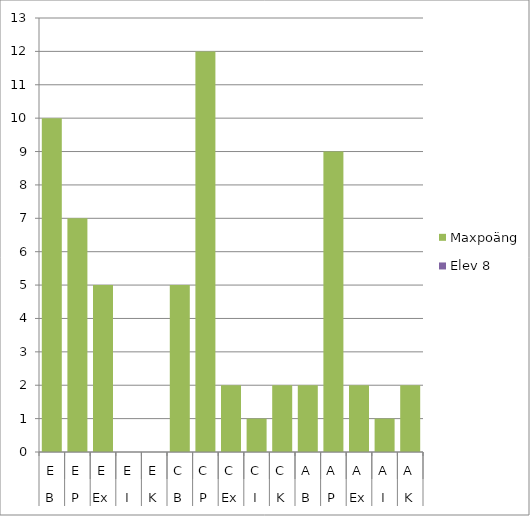
| Category | Maxpoäng | Elev 8 |
|---|---|---|
| 0 | 10 | 0 |
| 1 | 7 | 0 |
| 2 | 5 | 0 |
| 3 | 0 | 0 |
| 4 | 0 | 0 |
| 5 | 5 | 0 |
| 6 | 12 | 0 |
| 7 | 2 | 0 |
| 8 | 1 | 0 |
| 9 | 2 | 0 |
| 10 | 2 | 0 |
| 11 | 9 | 0 |
| 12 | 2 | 0 |
| 13 | 1 | 0 |
| 14 | 2 | 0 |